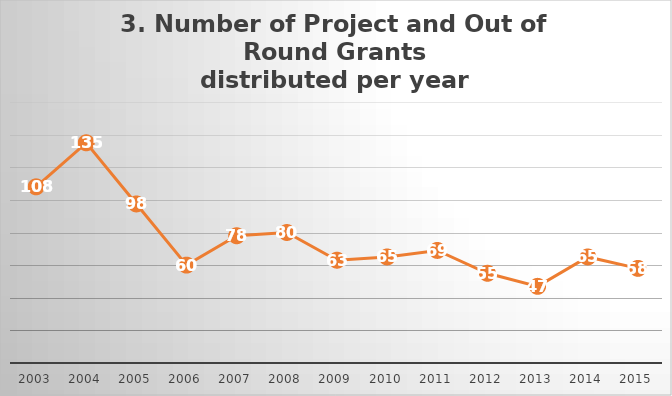
| Category | No. |
|---|---|
| 2003.0 | 108 |
| 2004.0 | 135 |
| 2005.0 | 97.5 |
| 2006.0 | 60 |
| 2007.0 | 78 |
| 2008.0 | 80 |
| 2009.0 | 63 |
| 2010.0 | 65 |
| 2011.0 | 69 |
| 2012.0 | 55 |
| 2013.0 | 47 |
| 2014.0 | 65 |
| 2015.0 | 58 |